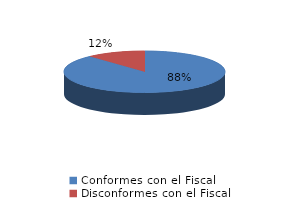
| Category | Series 0 |
|---|---|
| 0 | 1429 |
| 1 | 191 |